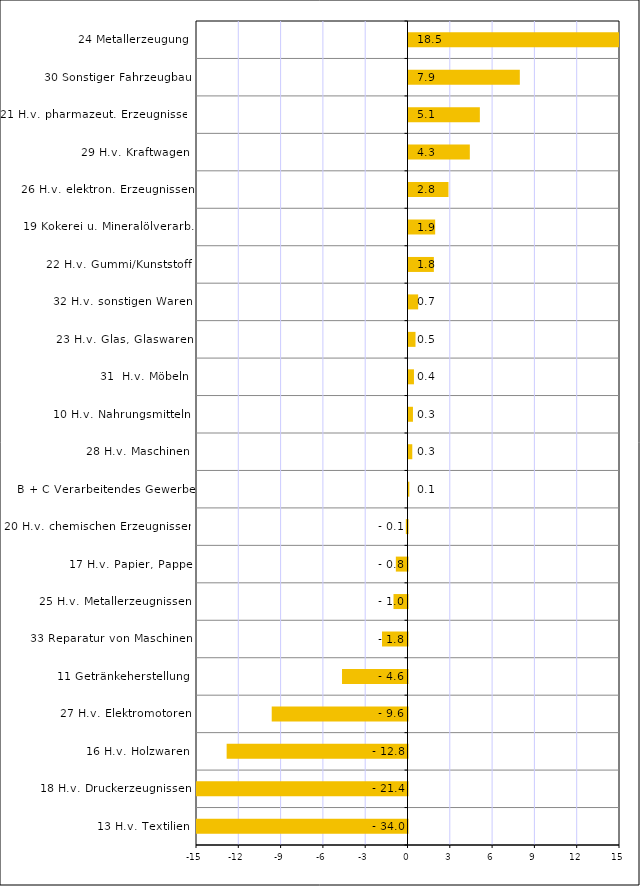
| Category | Series 0 |
|---|---|
| 13 H.v. Textilien | -34 |
| 18 H.v. Druckerzeugnissen | -21.422 |
| 16 H.v. Holzwaren | -12.826 |
| 27 H.v. Elektromotoren | -9.63 |
| 11 Getränkeherstellung | -4.644 |
| 33 Reparatur von Maschinen | -1.808 |
| 25 H.v. Metallerzeugnissen | -0.993 |
| 17 H.v. Papier, Pappe | -0.827 |
| 20 H.v. chemischen Erzeugnissen | -0.118 |
| B + C Verarbeitendes Gewerbe | 0.058 |
| 28 H.v. Maschinen | 0.269 |
| 10 H.v. Nahrungsmitteln | 0.315 |
| 31  H.v. Möbeln | 0.387 |
| 23 H.v. Glas, Glaswaren | 0.497 |
| 32 H.v. sonstigen Waren | 0.685 |
| 22 H.v. Gummi/Kunststoff | 1.799 |
| 19 Kokerei u. Mineralölverarb. | 1.891 |
| 26 H.v. elektron. Erzeugnissen | 2.834 |
| 29 H.v. Kraftwagen | 4.349 |
| 21 H.v. pharmazeut. Erzeugnissen | 5.061 |
| 30 Sonstiger Fahrzeugbau | 7.895 |
| 24 Metallerzeugung | 18.468 |